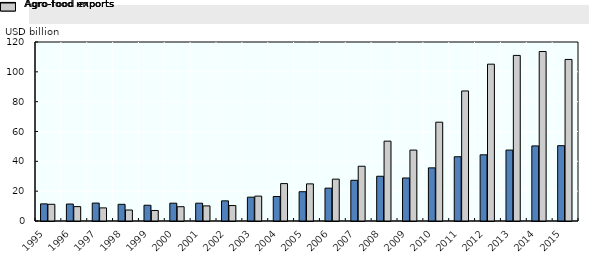
| Category | Agro-food exports | Agro-food imports |
|---|---|---|
| 1995.0 | 11.476 | 11.198 |
| 1996.0 | 11.373 | 9.644 |
| 1997.0 | 12.007 | 8.788 |
| 1998.0 | 11.177 | 7.368 |
| 1999.0 | 10.561 | 7.06 |
| 2000.0 | 11.942 | 9.577 |
| 2001.0 | 11.941 | 10.122 |
| 2002.0 | 13.506 | 10.356 |
| 2003.0 | 15.965 | 16.683 |
| 2004.0 | 16.417 | 25.067 |
| 2005.0 | 19.627 | 24.889 |
| 2006.0 | 22.026 | 28.062 |
| 2007.0 | 27.295 | 36.714 |
| 2008.0 | 30 | 53.532 |
| 2009.0 | 28.847 | 47.541 |
| 2010.0 | 35.62 | 66.235 |
| 2011.0 | 43.071 | 87.172 |
| 2012.0 | 44.364 | 105.146 |
| 2013.0 | 47.546 | 111.008 |
| 2014.0 | 50.341 | 113.637 |
| 2015.0 | 50.491 | 108.306 |